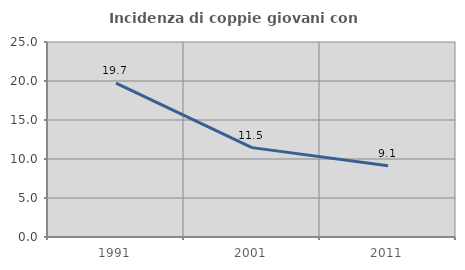
| Category | Incidenza di coppie giovani con figli |
|---|---|
| 1991.0 | 19.732 |
| 2001.0 | 11.458 |
| 2011.0 | 9.128 |